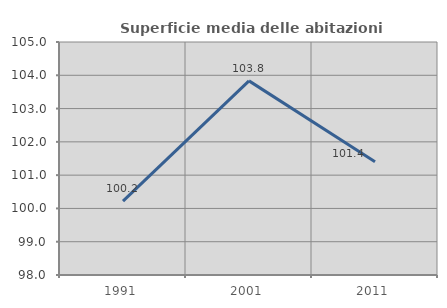
| Category | Superficie media delle abitazioni occupate |
|---|---|
| 1991.0 | 100.222 |
| 2001.0 | 103.832 |
| 2011.0 | 101.402 |